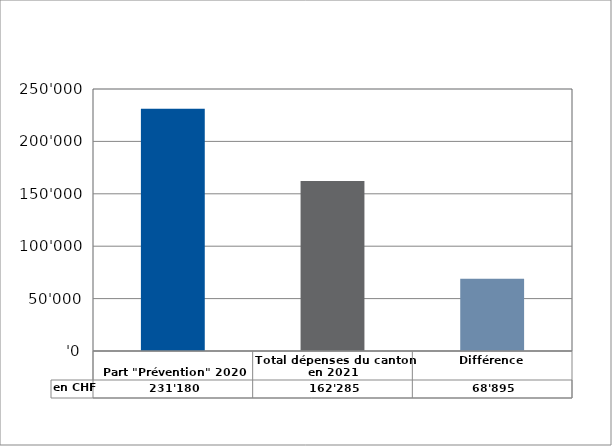
| Category | en CHF |
|---|---|
| 
Part "Prévention" 2020

 | 231180 |
| Total dépenses du canton en 2021 | 162285 |
| Différence | 68895 |